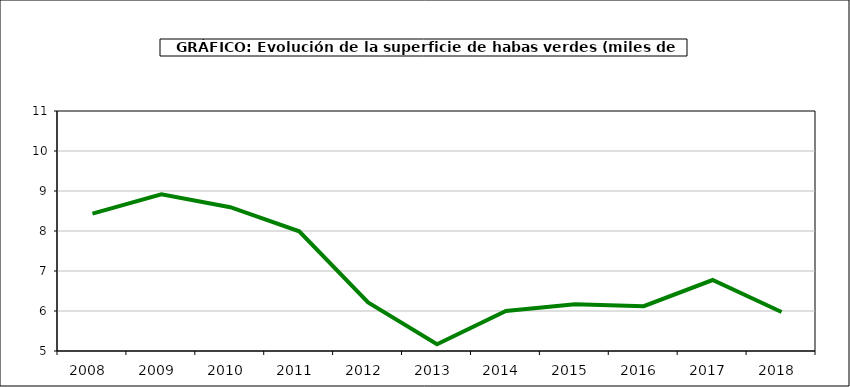
| Category | superficie |
|---|---|
| 2008.0 | 8.436 |
| 2009.0 | 8.92 |
| 2010.0 | 8.595 |
| 2011.0 | 7.993 |
| 2012.0 | 6.216 |
| 2013.0 | 5.17 |
| 2014.0 | 6.001 |
| 2015.0 | 6.169 |
| 2016.0 | 6.119 |
| 2017.0 | 6.774 |
| 2018.0 | 5.976 |